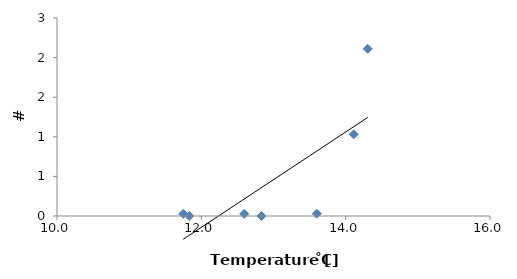
| Category | Nematoda/Bag  |
|---|---|
| 11.833333333 | 0 |
| 11.75 | 0.028 |
| 14.111111111 | 1.031 |
| 12.594444444 | 0.028 |
| 14.305555556 | 2.111 |
| 12.833333333 | 0 |
| 13.6 | 0.029 |